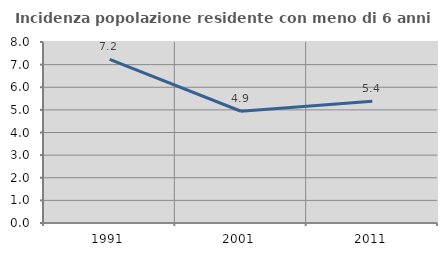
| Category | Incidenza popolazione residente con meno di 6 anni |
|---|---|
| 1991.0 | 7.234 |
| 2001.0 | 4.939 |
| 2011.0 | 5.384 |